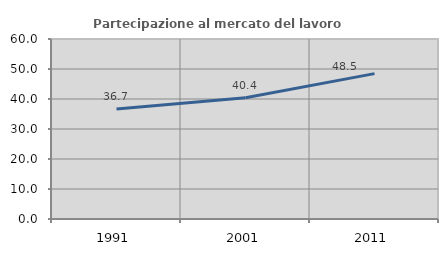
| Category | Partecipazione al mercato del lavoro  femminile |
|---|---|
| 1991.0 | 36.658 |
| 2001.0 | 40.441 |
| 2011.0 | 48.458 |